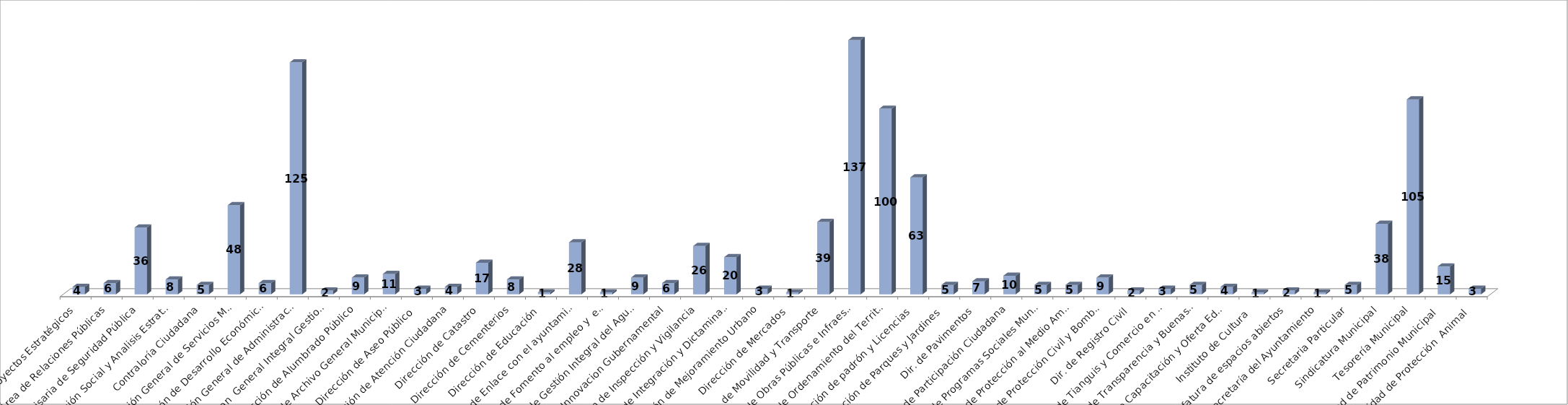
| Category | Series 0 | Series 1 |
|---|---|---|
| Area de Proyectos Estratégicos |  | 4 |
| Área de Relaciones Públicas |  | 6 |
| Comisaria de Seguridad Pública |  | 36 |
| Comunicación Social y Analisis Estrategico  |  | 8 |
| Contraloría Ciudadana |  | 5 |
| Coordinación General de Servicios Municipales |  | 48 |
| Coordinación de Desarrollo Económico Y Combate a la Desigualdad |  | 6 |
| Coordinación General de Administración e Innovación Gubernamental |  | 125 |
| Coordinacion  General Integral Gestion de la Ciudad |  | 2 |
| Dirección de Alumbrado Público |  | 9 |
| Dirección de Archivo General Municipal  |  | 11 |
| Dirección de Aseo Público  |  | 3 |
| Dirección de Atención Ciudadana |  | 4 |
| Dirección de Catastro |  | 17 |
| Dirección de Cementerios |  | 8 |
| Dirección de Educación  |  | 1 |
| Dirección de Enlace con el ayuntamiento |  | 28 |
| Dirección de Fomento al empleo y  emprendurismo         |  | 1 |
| Dirección de Gestión Integral del Agua y Drenaje |  | 9 |
| Dir. de Innovacion Gubernamental |  | 6 |
| Dirección de Inspección y Vigilancia |  | 26 |
| Dirección de Integración y Dictaminación |  | 20 |
| Dirección de Mejoramiento Urbano |  | 3 |
| Dirección de Mercados  |  | 1 |
| Dirección  de Movilidad y Transporte |  | 39 |
| Dirección de Obras Públicas e Infraestructura |  | 137 |
| Dirección de Ordenamiento del Territorio  |  | 100 |
| Dirección de padrón y Licencias  |  | 63 |
| Dirección de Parques y Jardines  |  | 5 |
| Dir. de Pavimentos |  | 7 |
| Dirección de Participación Ciudadana |  | 10 |
| Dirección de Programas Sociales Municipales |  | 5 |
| Dirección de Protección al Medio Ambiente  |  | 5 |
| Dirección de Protección Civil y Bomberos |  | 9 |
| Dir. de Registro Civil |  | 2 |
| Dirección de Tianguis y Comercio en espacios Abiertos |  | 3 |
| Dirección de Transparencia y Buenas Prácticas |  | 5 |
| Instituto de Capacitación y Oferta Educativa |  | 4 |
| Instituto de Cultura  |  | 1 |
| Jefatura de espacios abiertos |  | 2 |
| Secretaría del Ayuntamiento |  | 1 |
| Secretaria Particular |  | 5 |
| Sindicatura Municipal |  | 38 |
| Tesorería Municipal |  | 105 |
| Unidad de Patrimonio Municipal  |  | 15 |
| Unidad de Protección  Animal  |  | 3 |